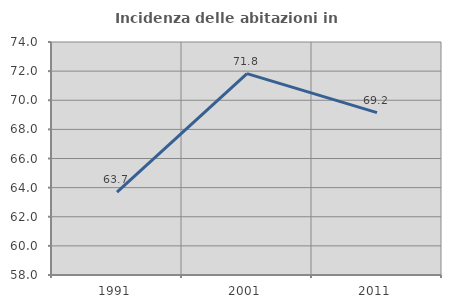
| Category | Incidenza delle abitazioni in proprietà  |
|---|---|
| 1991.0 | 63.692 |
| 2001.0 | 71.829 |
| 2011.0 | 69.152 |